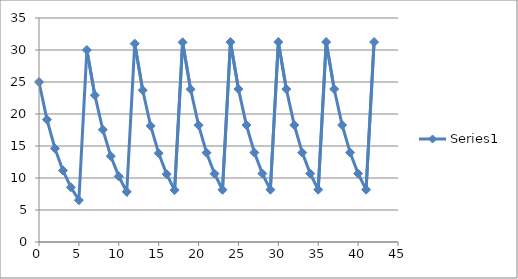
| Category | Series 0 |
|---|---|
| 0.0 | 25 |
| 1.0 | 19.118 |
| 2.0 | 14.62 |
| 3.0 | 11.18 |
| 4.0 | 8.55 |
| 5.0 | 6.538 |
| 6.0 | 30 |
| 7.0 | 22.942 |
| 8.0 | 17.544 |
| 9.0 | 13.416 |
| 10.0 | 10.26 |
| 11.0 | 7.846 |
| 12.0 | 31 |
| 13.0 | 23.706 |
| 14.0 | 18.129 |
| 15.0 | 13.864 |
| 16.0 | 10.602 |
| 17.0 | 8.107 |
| 18.0 | 31.2 |
| 19.0 | 23.859 |
| 20.0 | 18.246 |
| 21.0 | 13.953 |
| 22.0 | 10.67 |
| 23.0 | 8.16 |
| 24.0 | 31.24 |
| 25.0 | 23.89 |
| 26.0 | 18.269 |
| 27.0 | 13.971 |
| 28.0 | 10.684 |
| 29.0 | 8.17 |
| 30.0 | 31.248 |
| 31.0 | 23.896 |
| 32.0 | 18.274 |
| 33.0 | 13.974 |
| 34.0 | 10.687 |
| 35.0 | 8.172 |
| 36.0 | 31.25 |
| 37.0 | 23.897 |
| 38.0 | 18.275 |
| 39.0 | 13.975 |
| 40.0 | 10.687 |
| 41.0 | 8.173 |
| 42.0 | 31.25 |